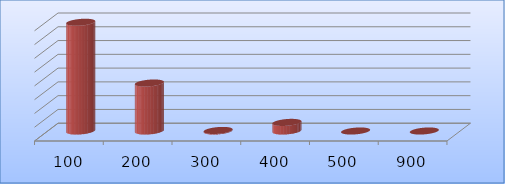
| Category | Series 0 |
|---|---|
| 100.0 | 39462243 |
| 200.0 | 17416028 |
| 300.0 | 200000 |
| 400.0 | 3122000 |
| 500.0 | 0 |
| 900.0 | 0 |